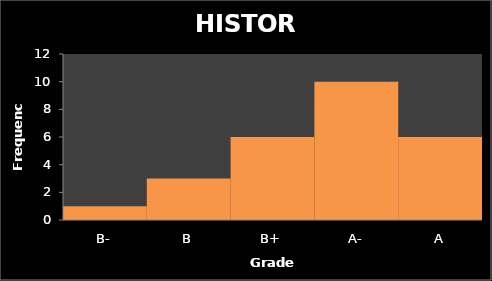
| Category | Series 0 |
|---|---|
| B- | 1 |
| B | 3 |
| B+ | 6 |
| A- | 10 |
| A | 6 |